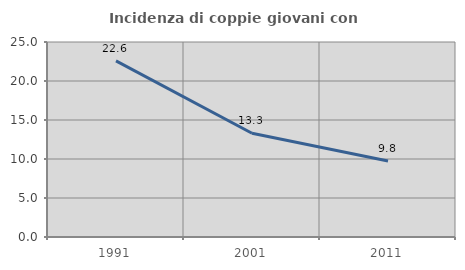
| Category | Incidenza di coppie giovani con figli |
|---|---|
| 1991.0 | 22.575 |
| 2001.0 | 13.298 |
| 2011.0 | 9.755 |